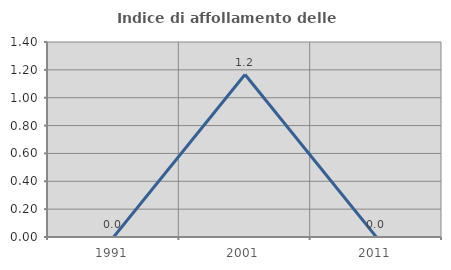
| Category | Indice di affollamento delle abitazioni  |
|---|---|
| 1991.0 | 0 |
| 2001.0 | 1.166 |
| 2011.0 | 0 |